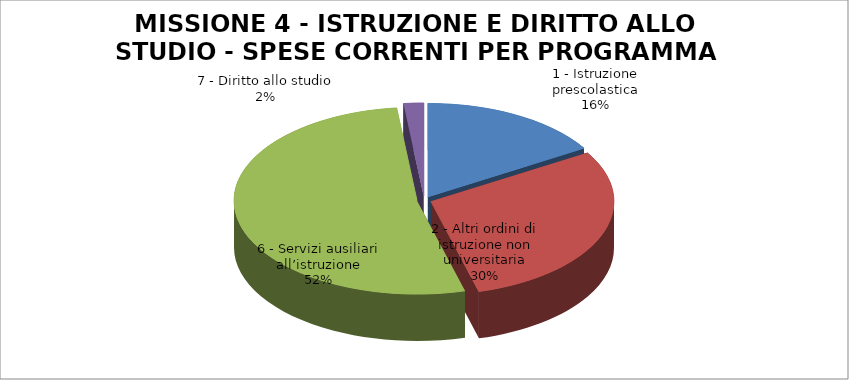
| Category | Series 0 |
|---|---|
| 1 - Istruzione prescolastica | 549690 |
| 2 - Altri ordini di istruzione non universitaria | 997076 |
| 6 - Servizi ausiliari all’istruzione | 1771981 |
| 7 - Diritto allo studio | 60000 |